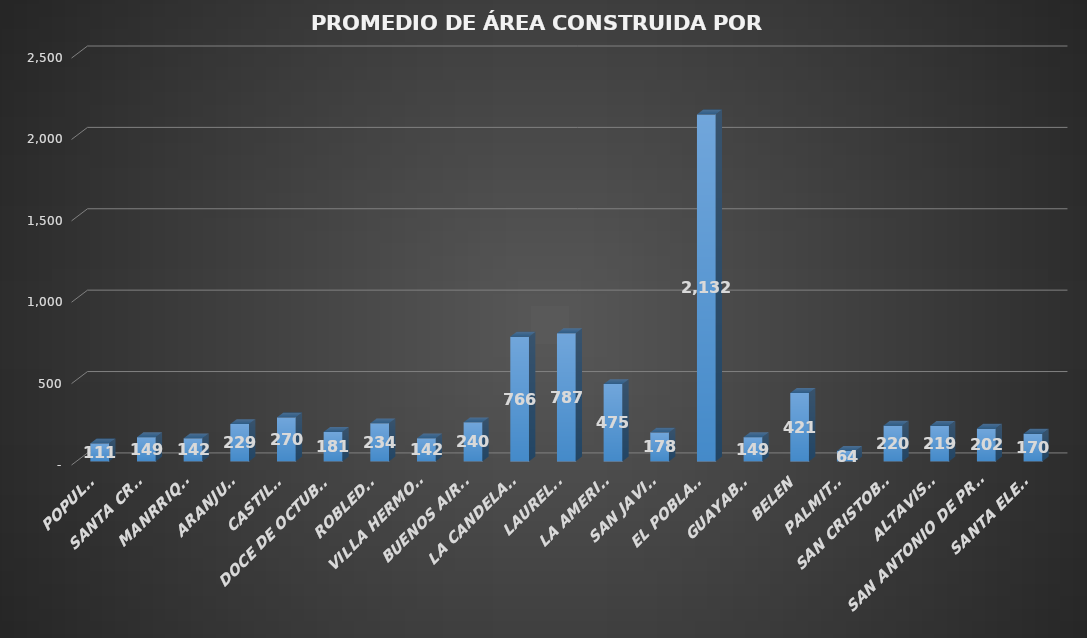
| Category | PromedioDeAreaCons |
|---|---|
| POPULAR | 110.609 |
| SANTA CRUZ | 148.619 |
| MANRRIQUE | 141.745 |
| ARANJUEZ | 229.499 |
| CASTILLA | 270.175 |
| DOCE DE OCTUBRE | 180.961 |
| ROBLEDO | 234.141 |
| VILLA HERMOSA | 141.784 |
| BUENOS AIRES | 240.169 |
| LA CANDELARIA | 766.428 |
| LAURELES | 787.451 |
| LA AMERICA | 474.76 |
| SAN JAVIER | 177.615 |
| EL POBLADO | 2131.725 |
| GUAYABAL | 148.74 |
| BELEN | 420.567 |
| PALMITAS | 64.377 |
| SAN CRISTOBAL | 220.222 |
| ALTAVISTA | 219.007 |
| SAN ANTONIO DE PRADO | 201.895 |
| SANTA ELENA | 170.147 |